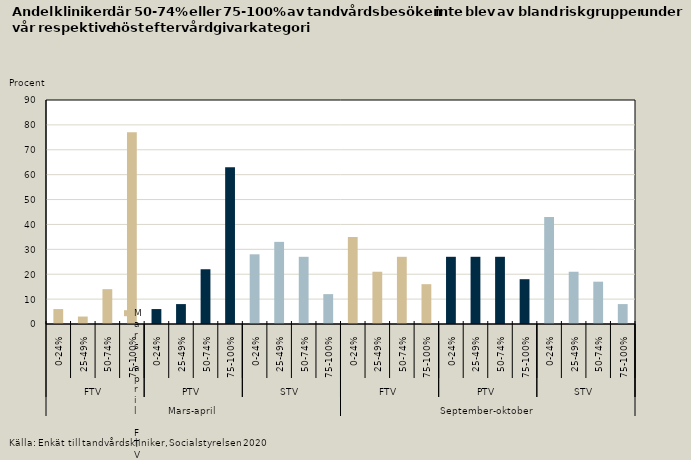
| Category | Riskgrupper |
|---|---|
| 0 | 6 |
| 1 | 3 |
| 2 | 14 |
| 3 | 77 |
| 4 | 6 |
| 5 | 8 |
| 6 | 22 |
| 7 | 63 |
| 8 | 28 |
| 9 | 33 |
| 10 | 27 |
| 11 | 12 |
| 12 | 35 |
| 13 | 21 |
| 14 | 27 |
| 15 | 16 |
| 16 | 27 |
| 17 | 27 |
| 18 | 27 |
| 19 | 18 |
| 20 | 43 |
| 21 | 21 |
| 22 | 17 |
| 23 | 8 |